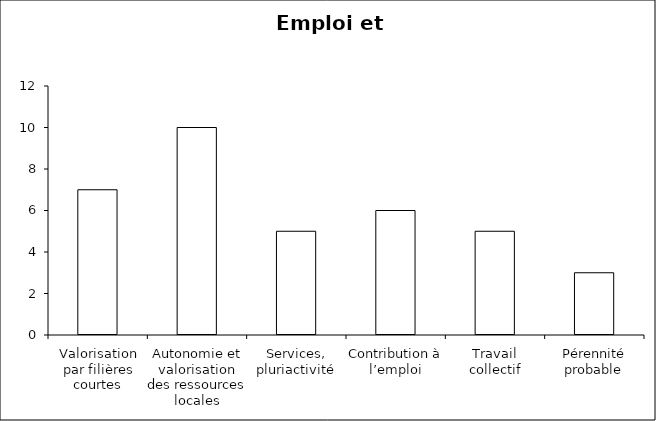
| Category | Series 0 | Series 1 |
|---|---|---|
| Valorisation par filières courtes | 0 | 7 |
| Autonomie et valorisation des ressources locales | 0 | 10 |
| Services, pluriactivité | 0 | 5 |
| Contribution à l’emploi | 0 | 6 |
| Travail collectif | 0 | 5 |
| Pérennité probable | 0 | 3 |